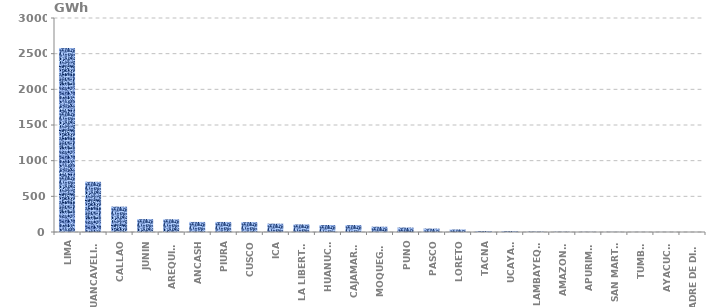
| Category | Series 0 |
|---|---|
| LIMA | 2579.771 |
| HUANCAVELICA | 704.104 |
| CALLAO | 355.618 |
| JUNIN | 181.472 |
| AREQUIPA | 178.339 |
| ANCASH | 141.116 |
| PIURA | 140.847 |
| CUSCO | 139.319 |
| ICA | 116.602 |
| LA LIBERTAD | 106.374 |
| HUANUCO | 98.51 |
| CAJAMARCA | 97.174 |
| MOQUEGUA | 74.202 |
| PUNO | 62.472 |
| PASCO | 47.858 |
| LORETO | 35.386 |
| TACNA | 13.401 |
| UCAYALI | 12.553 |
| LAMBAYEQUE | 5.972 |
| AMAZONAS | 3.999 |
| APURIMAC | 2.667 |
| SAN MARTÍN | 1.95 |
| TUMBES | 1.101 |
| AYACUCHO | 0.878 |
| MADRE DE DIOS | 0.184 |